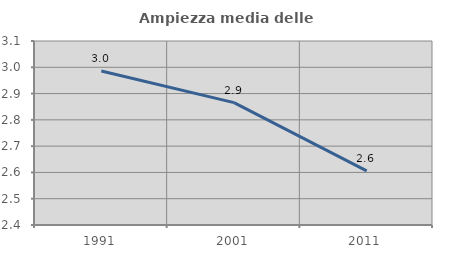
| Category | Ampiezza media delle famiglie |
|---|---|
| 1991.0 | 2.986 |
| 2001.0 | 2.866 |
| 2011.0 | 2.606 |